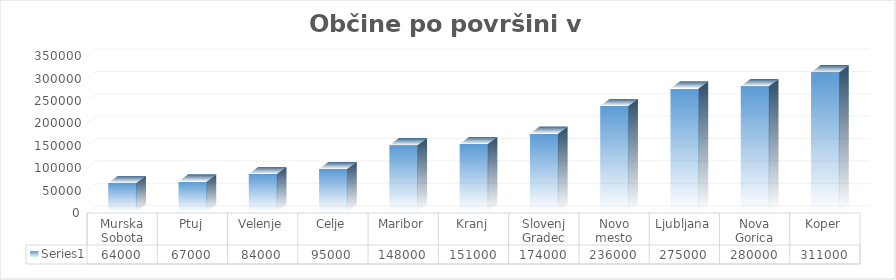
| Category | Series 0 |
|---|---|
| Murska Sobota | 64000 |
| Ptuj | 67000 |
| Velenje | 84000 |
| Celje | 95000 |
| Maribor | 148000 |
| Kranj | 151000 |
| Slovenj Gradec | 174000 |
| Novo mesto | 236000 |
| Ljubljana | 275000 |
| Nova Gorica | 280000 |
| Koper | 311000 |